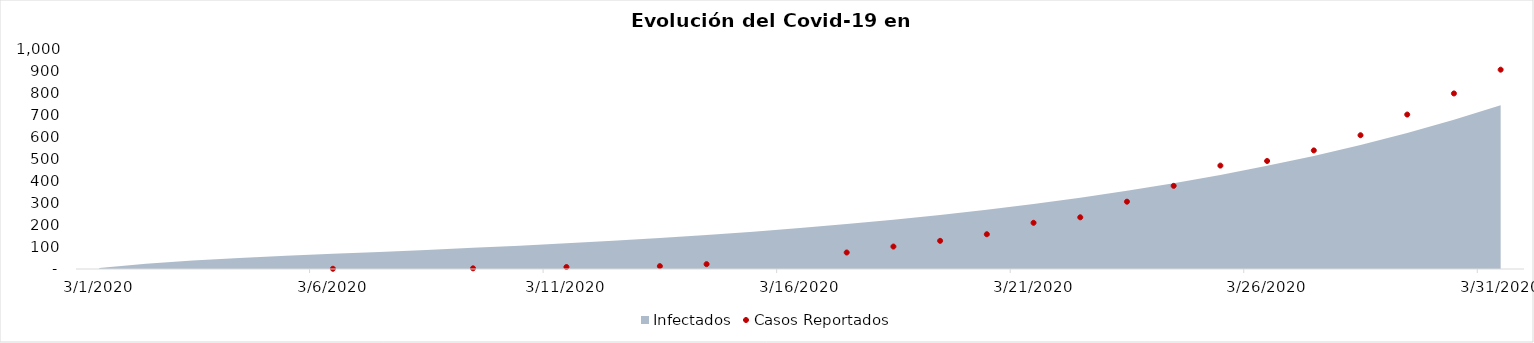
| Category | Infectados |
|---|---|
| 3/1/20 | 5 |
| 3/2/20 | 23.939 |
| 3/3/20 | 38.301 |
| 3/4/20 | 49.869 |
| 3/5/20 | 59.825 |
| 3/6/20 | 68.964 |
| 3/7/20 | 77.823 |
| 3/8/20 | 86.782 |
| 3/9/20 | 96.112 |
| 3/10/20 | 106.021 |
| 3/11/20 | 116.679 |
| 3/12/20 | 128.23 |
| 3/13/20 | 140.81 |
| 3/14/20 | 154.548 |
| 3/15/20 | 169.578 |
| 3/16/20 | 186.038 |
| 3/17/20 | 204.074 |
| 3/18/20 | 223.845 |
| 3/19/20 | 245.523 |
| 3/20/20 | 269.295 |
| 3/21/20 | 295.364 |
| 3/22/20 | 323.954 |
| 3/23/20 | 355.31 |
| 3/24/20 | 389.7 |
| 3/25/20 | 427.418 |
| 3/26/20 | 468.786 |
| 3/27/20 | 514.157 |
| 3/28/20 | 563.919 |
| 3/29/20 | 618.497 |
| 3/30/20 | 678.357 |
| 3/31/20 | 744.011 |